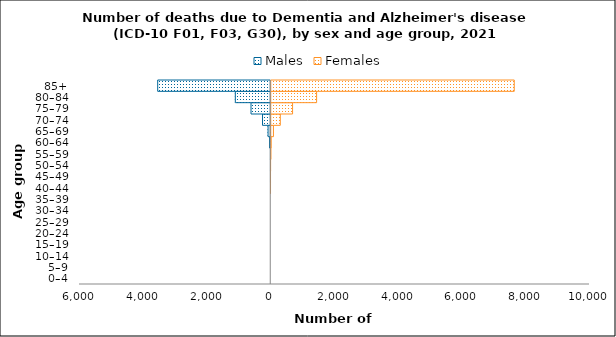
| Category | Males | Females |
|---|---|---|
| 0–4 | 0 | 0 |
| 5–9 | 0 | 0 |
| 10–14 | 0 | 0 |
| 15–19 | 0 | 0 |
| 20–24 | 0 | 0 |
| 25–29 | 0 | 0 |
| 30–34 | 0 | 0 |
| 35–39 | 0 | 0 |
| 40–44 | 0 | 1 |
| 45–49 | -1 | 1 |
| 50–54 | -2 | 6 |
| 55–59 | -5 | 16 |
| 60–64 | -37 | 27 |
| 65–69 | -84 | 100 |
| 70–74 | -258 | 316 |
| 75–79 | -619 | 700 |
| 80–84 | -1111 | 1454 |
| 85+ | -3547 | 7655 |